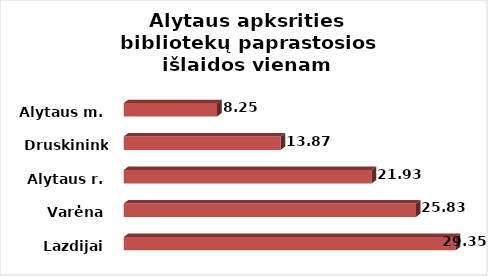
| Category | Series 0 |
|---|---|
| Lazdijai | 29.346 |
| Varėna | 25.833 |
| Alytaus r. | 21.925 |
| Druskininkai | 13.871 |
| Alytaus m. | 8.252 |